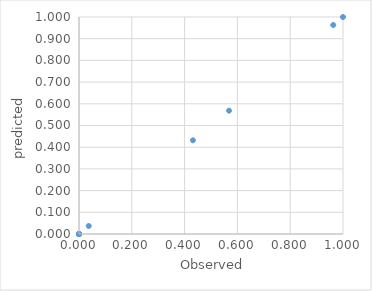
| Category | Predicted |
|---|---|
| 1.0 | 1 |
| 0.0 | 0 |
| 0.0 | 0 |
| 0.0 | 0 |
| 0.963 | 0.963 |
| 0.037 | 0.037 |
| 0.5683168316831683 | 0.568 |
| 0.4316831683168317 | 0.432 |
| 0.0 | 0 |
| 0.0 | 0 |